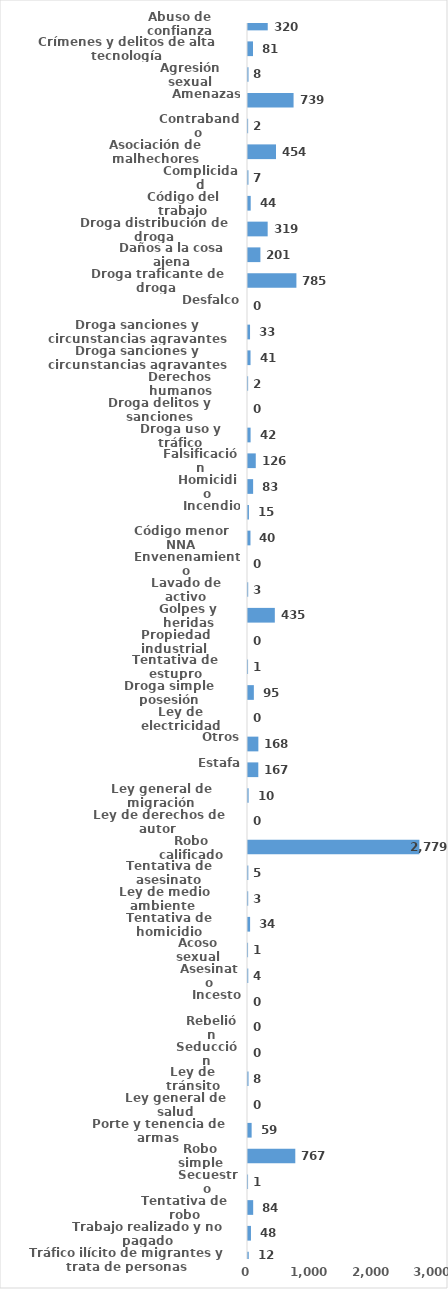
| Category | Series 0 |
|---|---|
| Abuso de confianza | 320 |
| Crímenes y delitos de alta tecnología | 81 |
| Agresión sexual | 8 |
| Amenazas | 739 |
| Contrabando | 2 |
| Asociación de malhechores | 454 |
| Complicidad | 7 |
| Código del trabajo | 44 |
| Droga distribución de droga | 319 |
| Daños a la cosa ajena | 201 |
| Droga traficante de droga  | 785 |
| Desfalco | 0 |
| Droga sanciones y circunstancias agravantes | 33 |
| Droga sanciones y circunstancias agravantes | 41 |
| Derechos humanos | 2 |
| Droga delitos y sanciones | 0 |
| Droga uso y tráfico | 42 |
| Falsificación | 126 |
| Homicidio | 83 |
| Incendio | 15 |
| Código menor NNA | 40 |
| Envenenamiento | 0 |
| Lavado de activo | 3 |
| Golpes y heridas | 435 |
| Propiedad industrial  | 0 |
| Tentativa de estupro | 1 |
| Droga simple posesión | 95 |
| Ley de electricidad | 0 |
| Otros | 168 |
| Estafa | 167 |
| Ley general de migración | 10 |
| Ley de derechos de autor  | 0 |
| Robo calificado | 2779 |
| Tentativa de asesinato | 5 |
| Ley de medio ambiente  | 3 |
| Tentativa de homicidio | 34 |
| Acoso sexual | 1 |
| Asesinato | 4 |
| Incesto | 0 |
| Rebelión | 0 |
| Seducción | 0 |
| Ley de tránsito | 8 |
| Ley general de salud | 0 |
| Porte y tenencia de armas | 59 |
| Robo simple | 767 |
| Secuestro | 1 |
| Tentativa de robo | 84 |
| Trabajo realizado y no pagado | 48 |
| Tráfico ilícito de migrantes y trata de personas | 12 |